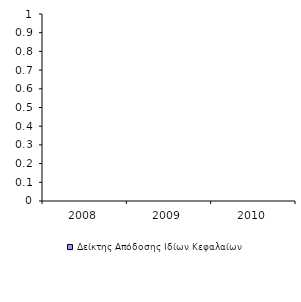
| Category | Δείκτης Απόδοσης Ιδίων Κεφαλαίων |
|---|---|
| 2008.0 | 0 |
| 2009.0 | 0 |
| 2010.0 | 0 |